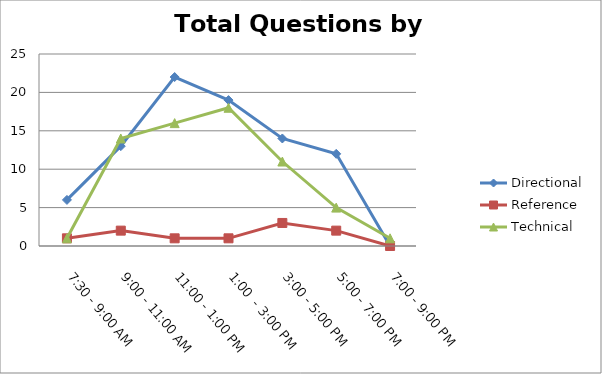
| Category | Directional | Reference | Technical |
|---|---|---|---|
| 7:30 - 9:00 AM | 6 | 1 | 1 |
| 9:00 - 11:00 AM | 13 | 2 | 14 |
| 11:00 - 1:00 PM | 22 | 1 | 16 |
| 1:00  - 3:00 PM | 19 | 1 | 18 |
| 3:00 - 5:00 PM | 14 | 3 | 11 |
| 5:00 - 7:00 PM | 12 | 2 | 5 |
| 7:00 - 9:00 PM | 0 | 0 | 1 |